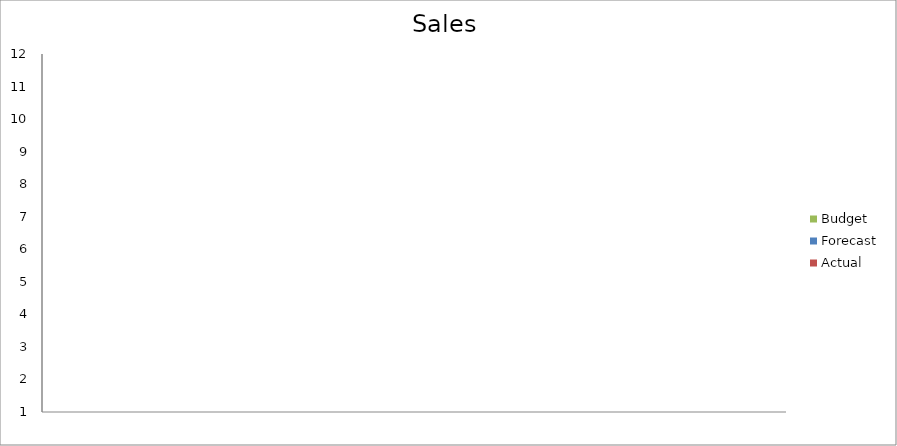
| Category | Budget | Forecast | Actual |
|---|---|---|---|
| 0 | 2080 | 950 | 2330 |
| 1 | 2550 | 2240 | 1480 |
| 2 | 2350 | 3370 | 980 |
| 3 | 1090 | 1910 | 950 |
| 4 | 2010 | 1240 | 2910 |
| 5 | 1230 | 580 | 660 |
| 6 | 2480 | 3440 | 2700 |
| 7 | 3200 | 3380 | 3310 |
| 8 | 1200 | 2890 | 3440 |
| 9 | 680 | 2100 | 1450 |
| 10 | 2010 | 2350 | 590 |
| 11 | 1960 | 3310 | 1300 |